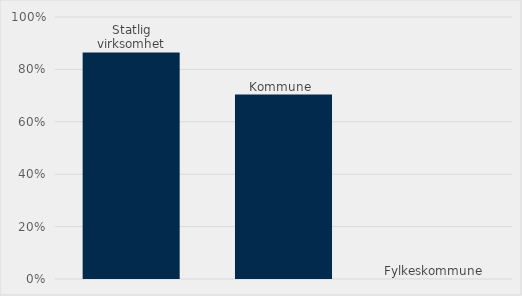
| Category | Estimert verdi som har krav til Type 1 - miljømerke |
|---|---|
| Statlig virksomhet | 0.865 |
| Kommune  | 0.704 |
| Fylkeskommune | 0 |